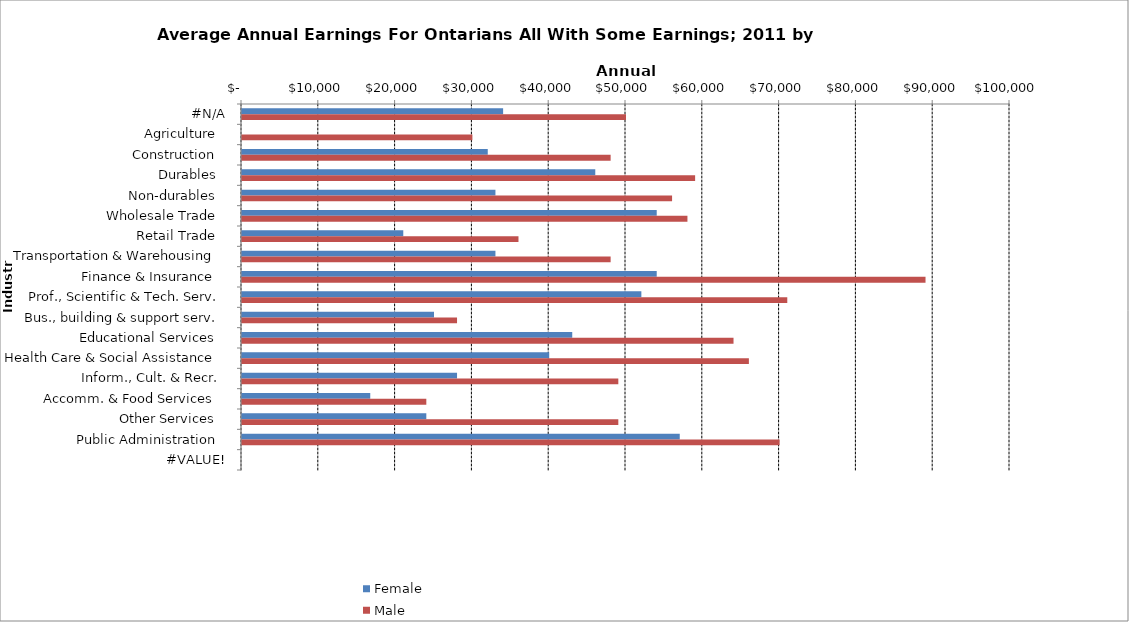
| Category | Female | Male |
|---|---|---|
|  #N/A  | 34000 | 50000 |
|  Agriculture   | 0 | 30000 |
|  Construction   | 32000 | 48000 |
|  Durables   | 46000 | 59000 |
|  Non-durables   | 33000 | 56000 |
|  Wholesale Trade   | 54000 | 58000 |
|  Retail Trade   | 21000 | 36000 |
|  Transportation & Warehousing   | 33000 | 48000 |
|  Finance & Insurance   | 54000 | 89000 |
|  Prof., Scientific & Tech. Serv.  | 52000 | 71000 |
|  Bus., building & support serv.  | 25000 | 28000 |
|  Educational Services   | 43000 | 64000 |
|  Health Care & Social Assistance   | 40000 | 66000 |
|  Inform., Cult. & Recr.  | 28000 | 49000 |
|  Accomm. & Food Services   | 16700 | 24000 |
|  Other Services   | 24000 | 49000 |
|  Public Administration   | 57000 | 70000 |
|  #VALUE!  | 0 | 0 |